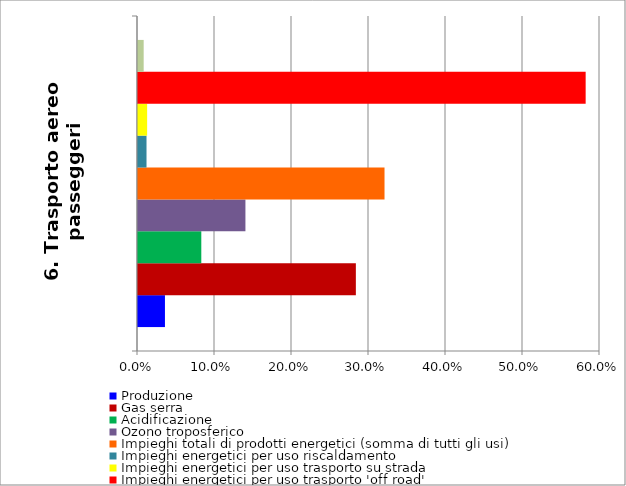
| Category | Produzione | Gas serra | Acidificazione | Ozono troposferico | Impieghi totali di prodotti energetici (somma di tutti gli usi) | Impieghi energetici per uso riscaldamento | Impieghi energetici per uso trasporto su strada | Impieghi energetici per uso trasporto 'off road' | Impieghi di elettricità |
|---|---|---|---|---|---|---|---|---|---|
| 6. Trasporto aereo passeggeri | 0.035 | 0.283 | 0.082 | 0.14 | 0.32 | 0.011 | 0.012 | 0.581 | 0.007 |